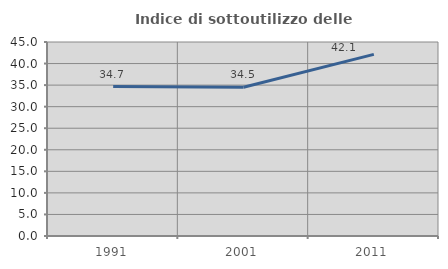
| Category | Indice di sottoutilizzo delle abitazioni  |
|---|---|
| 1991.0 | 34.667 |
| 2001.0 | 34.498 |
| 2011.0 | 42.135 |